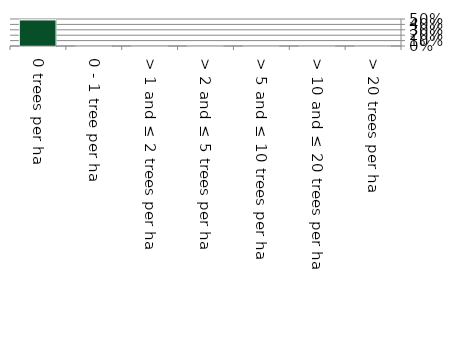
| Category | Native |
|---|---|
| 0 trees per ha | 0.483 |
| 0 - 1 tree per ha | 0 |
| > 1 and ≤ 2 trees per ha | 0.001 |
| > 2 and ≤ 5 trees per ha | 0.002 |
| > 5 and ≤ 10 trees per ha | 0.001 |
| > 10 and ≤ 20 trees per ha | 0 |
| > 20 trees per ha | 0 |